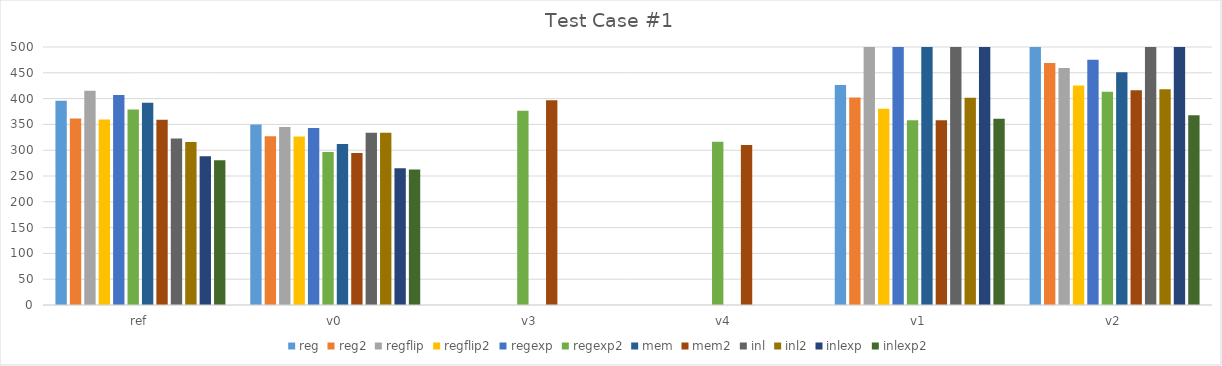
| Category | reg | reg2 | regflip | regflip2 | regexp | regexp2 | mem | mem2 | inl | inl2 | inlexp | inlexp2 |
|---|---|---|---|---|---|---|---|---|---|---|---|---|
| ref | 395.836 | 361.59 | 415.288 | 359.596 | 406.879 | 378.711 | 391.783 | 359.062 | 322.658 | 316.124 | 288.061 | 280.302 |
| v0 | 349.682 | 327.015 | 344.93 | 326.448 | 343.132 | 296.478 | 312.078 | 294.75 | 333.663 | 333.739 | 265.225 | 262.834 |
| v3 | 0 | 0 | 0 | 0 | 0 | 376.665 | 0 | 396.984 | 0 | 0 | 0 | 0 |
| v4 | 0 | 0 | 0 | 0 | 0 | 316.4 | 0 | 309.843 | 0 | 0 | 0 | 0 |
| v1 | 426.455 | 402.078 | 597.755 | 380.461 | 595.158 | 358.125 | 548.155 | 358.095 | 580.331 | 401.784 | 595.153 | 361.061 |
| v2 | 611.204 | 468.958 | 459.083 | 425.224 | 475.305 | 413.128 | 451.113 | 416.183 | 582.264 | 418.061 | 614.184 | 367.499 |